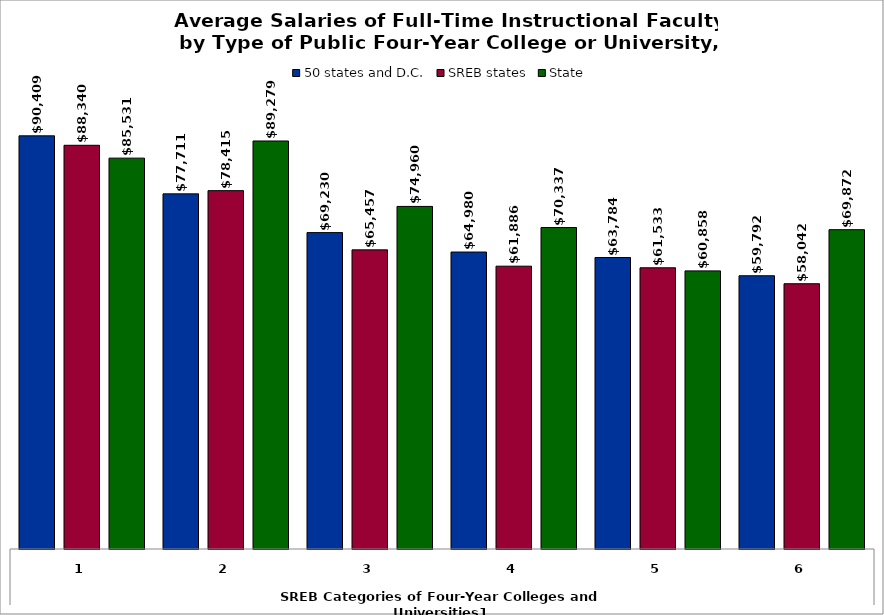
| Category | 50 states and D.C. | SREB states | State |
|---|---|---|---|
| 0 | 90409.358 | 88339.675 | 85530.593 |
| 1 | 77710.739 | 78414.973 | 89279.469 |
| 2 | 69229.923 | 65457.146 | 74959.591 |
| 3 | 64980.077 | 61886.09 | 70336.698 |
| 4 | 63784.485 | 61532.584 | 60857.88 |
| 5 | 59791.883 | 58041.93 | 69872.389 |